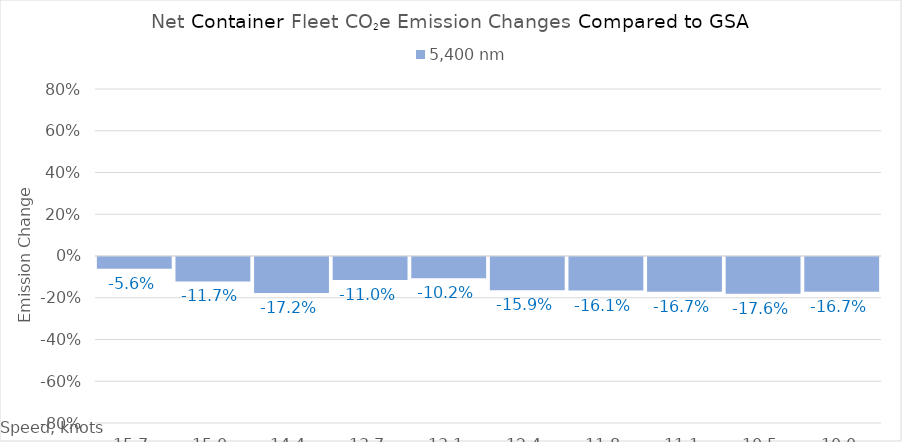
| Category | 5,400 |
|---|---|
| 15.65 | -0.056 |
| 15.0 | -0.117 |
| 14.35 | -0.172 |
| 13.7 | -0.11 |
| 13.049999999999999 | -0.102 |
| 12.399999999999999 | -0.159 |
| 11.749999999999998 | -0.161 |
| 11.099999999999998 | -0.167 |
| 10.449999999999998 | -0.176 |
| 10.0 | -0.167 |